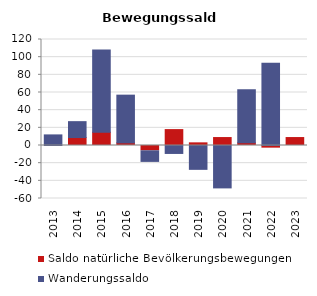
| Category | Saldo natürliche Bevölkerungsbewegungen | Wanderungssaldo |
|---|---|---|
| 2013.0 | 0 | 12 |
| 2014.0 | 9 | 18 |
| 2015.0 | 15 | 93 |
| 2016.0 | 3 | 54 |
| 2017.0 | -6 | -12 |
| 2018.0 | 18 | -9 |
| 2019.0 | 3 | -27 |
| 2020.0 | 9 | -48 |
| 2021.0 | 3 | 60 |
| 2022.0 | -3 | 93 |
| 2023.0 | 9 | 0 |